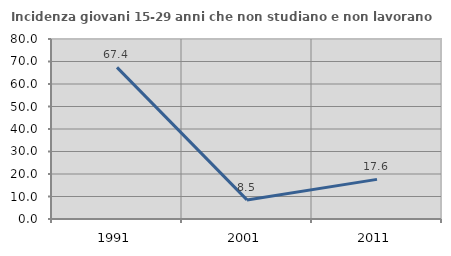
| Category | Incidenza giovani 15-29 anni che non studiano e non lavorano  |
|---|---|
| 1991.0 | 67.384 |
| 2001.0 | 8.483 |
| 2011.0 | 17.606 |